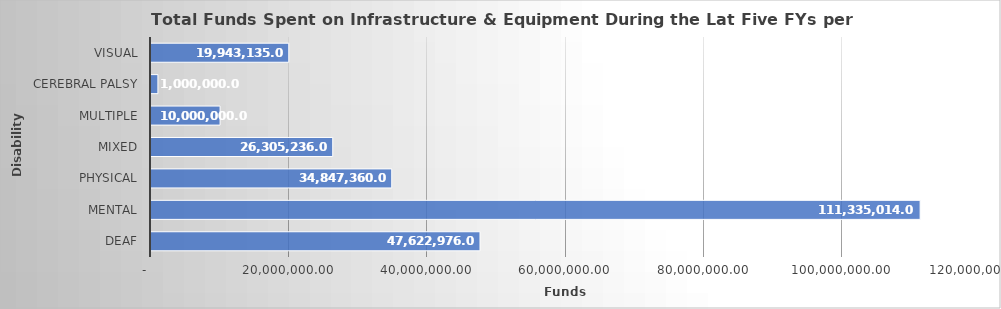
| Category | Total |
|---|---|
| DEAF | 47622976 |
| MENTAL | 111335014 |
| PHYSICAL | 34847360 |
| MIXED | 26305236 |
| MULTIPLE | 10000000 |
| CEREBRAL PALSY | 1000000 |
| VISUAL | 19943135 |